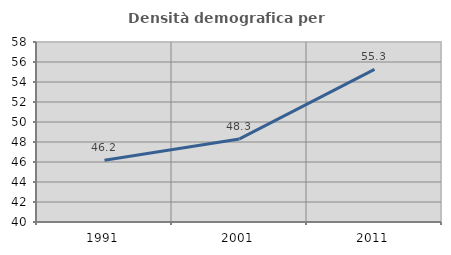
| Category | Densità demografica |
|---|---|
| 1991.0 | 46.181 |
| 2001.0 | 48.306 |
| 2011.0 | 55.256 |